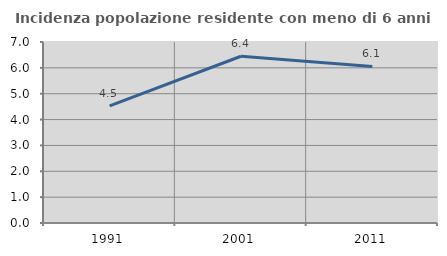
| Category | Incidenza popolazione residente con meno di 6 anni |
|---|---|
| 1991.0 | 4.527 |
| 2001.0 | 6.449 |
| 2011.0 | 6.054 |